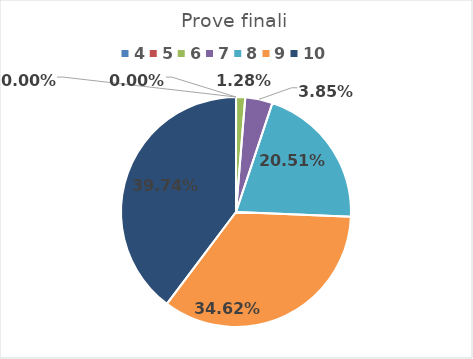
| Category | Series 0 |
|---|---|
| 4.0 | 0 |
| 5.0 | 0 |
| 6.0 | 0.013 |
| 7.0 | 0.038 |
| 8.0 | 0.205 |
| 9.0 | 0.346 |
| 10.0 | 0.397 |